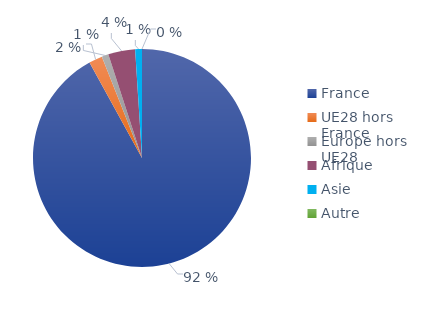
| Category | Series 0 |
|---|---|
| France | 0.92 |
| UE28 hors France | 0.02 |
| Europe hors UE28 | 0.01 |
| Afrique | 0.04 |
| Asie | 0.01 |
| Autre | 0 |